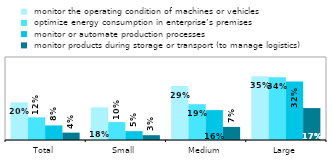
| Category |  monitor the operating condition of machines or vehicles  |  optimize energy consumption in enterprise’s premises |  monitor or automate production processes |  monitor products during storage or transport (to manage logistics) |
|---|---|---|---|---|
| Total | 0.204 | 0.123 | 0.079 | 0.04 |
| Small | 0.177 | 0.097 | 0.048 | 0.026 |
| Medium | 0.293 | 0.194 | 0.162 | 0.071 |
| Large | 0.345 | 0.34 | 0.317 | 0.173 |